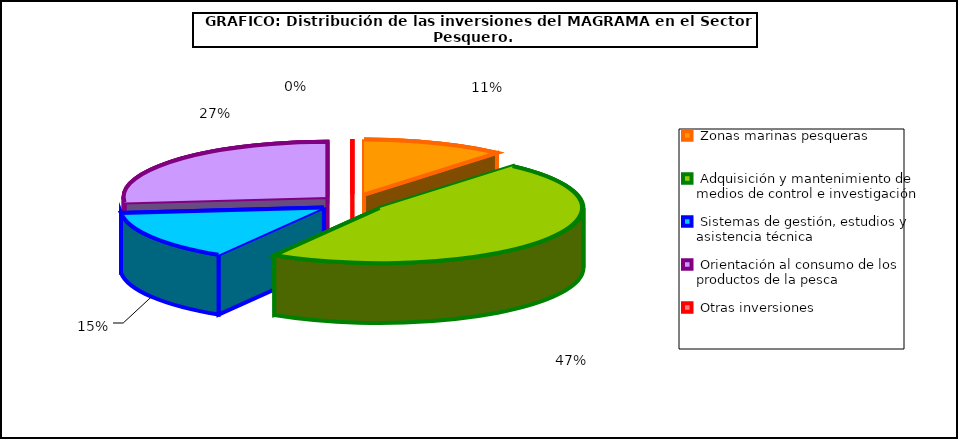
| Category | Series 0 |
|---|---|
|  Zonas marinas pesqueras | 2979.25 |
|  Adquisición y mantenimiento de medios de control e investigación  | 12480.01 |
|  Sistemas de gestión, estudios y asistencia técnica | 3897.51 |
|  Orientación al consumo de los productos de la pesca | 7004.42 |
|  Otras inversiones  | 0 |